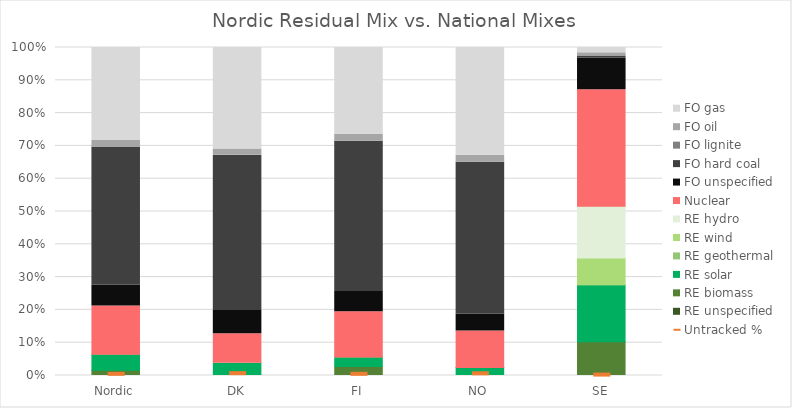
| Category | RE unspecified | RE biomass | RE solar | RE geothermal | RE wind | RE hydro | Nuclear | FO unspecified | FO hard coal | FO lignite | FO oil | FO gas |
|---|---|---|---|---|---|---|---|---|---|---|---|---|
| Nordic | 0 | 0.016 | 0.049 | 0 | 0 | 0 | 0.147 | 0.064 | 0.421 | 0.001 | 0.019 | 0.284 |
| DK | 0 | 0 | 0.041 | 0 | 0 | 0 | 0.087 | 0.071 | 0.472 | 0.001 | 0.019 | 0.31 |
| FI | 0 | 0.028 | 0.028 | 0 | 0 | 0 | 0.138 | 0.062 | 0.458 | 0.001 | 0.02 | 0.265 |
| NO | 0 | 0 | 0.024 | 0 | 0 | 0 | 0.112 | 0.052 | 0.463 | 0.001 | 0.02 | 0.329 |
| SE | 0 | 0.103 | 0.174 | 0 | 0.082 | 0.158 | 0.355 | 0.096 | 0.006 | 0 | 0.011 | 0.016 |